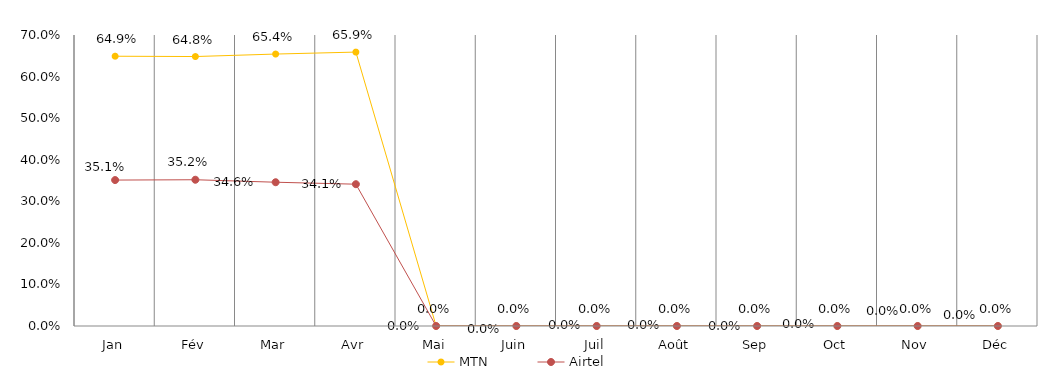
| Category | MTN | Airtel |
|---|---|---|
| Jan | 0.649 | 0.351 |
| Fév | 0.648 | 0.352 |
| Mar | 0.654 | 0.346 |
| Avr | 0.659 | 0.341 |
| Mai | 0 | 0 |
| Juin | 0 | 0 |
| Juil | 0 | 0 |
| Août | 0 | 0 |
| Sep | 0 | 0 |
| Oct | 0 | 0 |
| Nov | 0 | 0 |
| Déc | 0 | 0 |